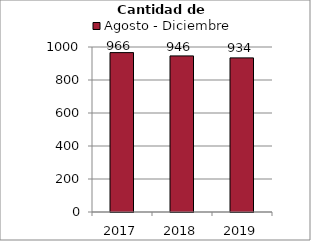
| Category | Agosto - Diciembre |
|---|---|
| 2017.0 | 966 |
| 2018.0 | 946 |
| 2019.0 | 934 |